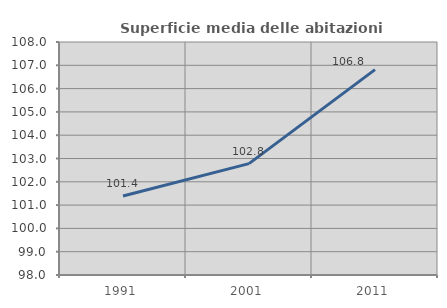
| Category | Superficie media delle abitazioni occupate |
|---|---|
| 1991.0 | 101.392 |
| 2001.0 | 102.779 |
| 2011.0 | 106.814 |